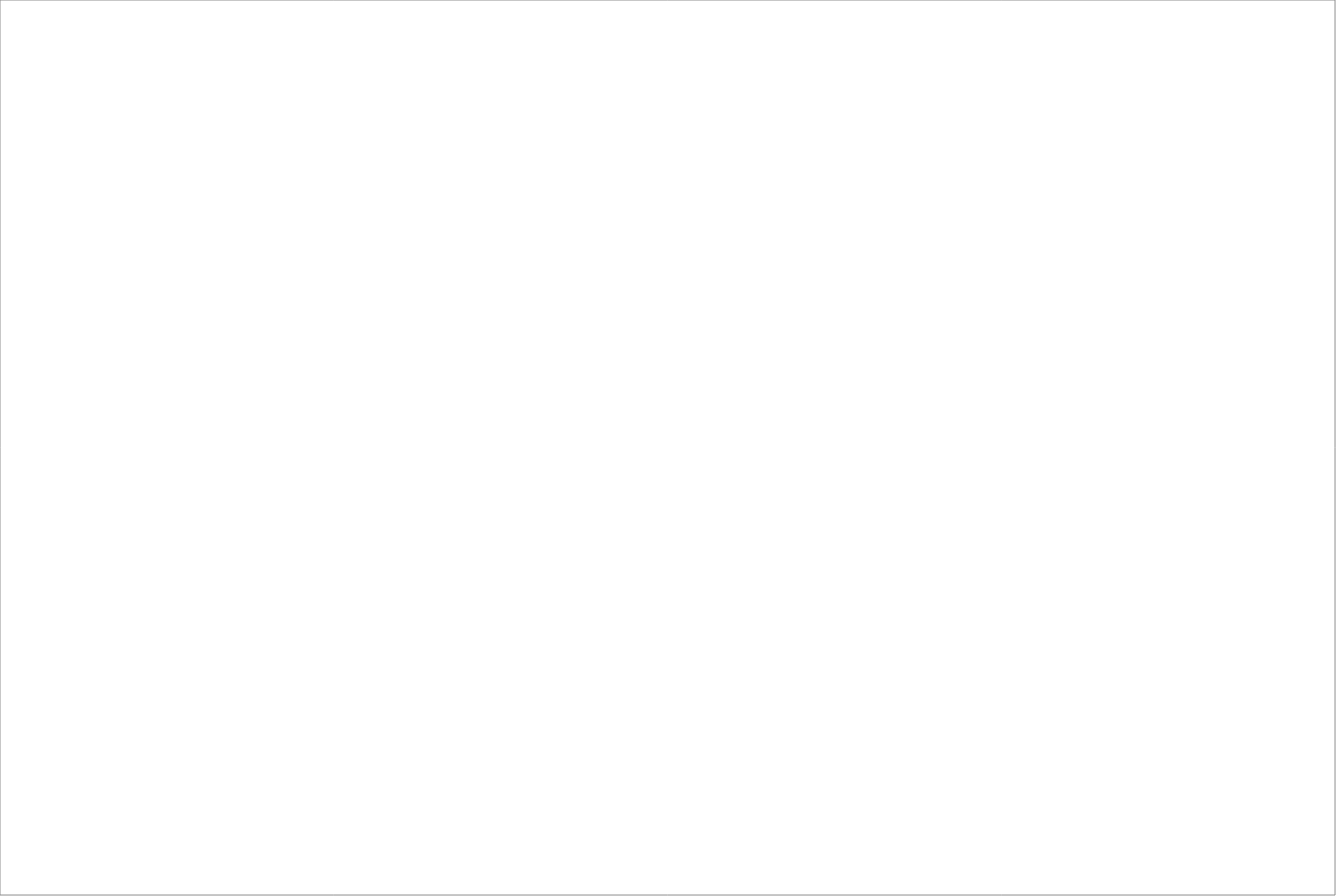
| Category | Total |
|---|---|
| Adecco Sweden Aktiebolag | 70 |
| Poolia Sverige Aktiebolag | 65 |
| StudentConsulting Sweden AB | 65 |
| Experis AB | 62.5 |
| Academic Work Sweden AB | 62.5 |